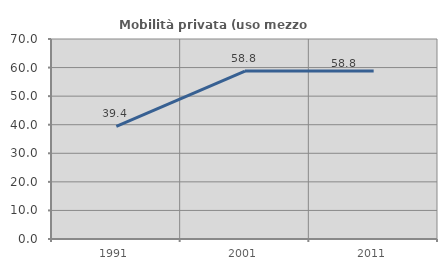
| Category | Mobilità privata (uso mezzo privato) |
|---|---|
| 1991.0 | 39.429 |
| 2001.0 | 58.766 |
| 2011.0 | 58.803 |